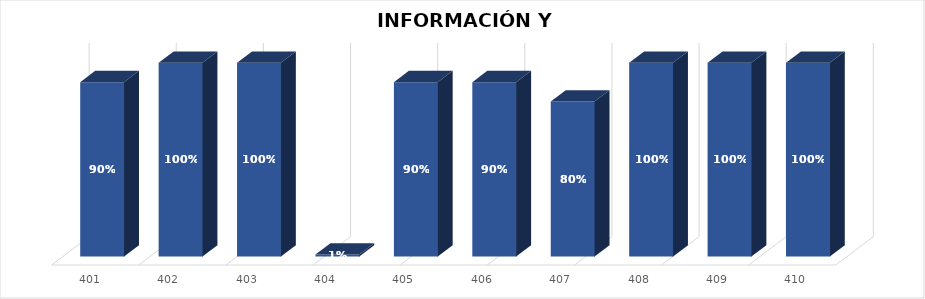
| Category | % Avance |
|---|---|
| 401.0 | 0.9 |
| 402.0 | 1 |
| 403.0 | 1 |
| 404.0 | 0.01 |
| 405.0 | 0.9 |
| 406.0 | 0.9 |
| 407.0 | 0.8 |
| 408.0 | 1 |
| 409.0 | 1 |
| 410.0 | 1 |